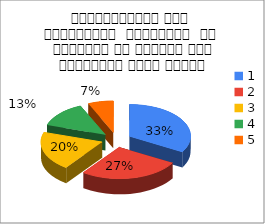
| Category | Series 0 | महाविद्यालय में  कार्यस्थल  सहयोगीयो    के  व्यवहार के संदर्भ में संतुष्टि स्तर बताइए |
|---|---|---|
| 0 | 5 | 4 |
| 1 | 4 | 4 |
| 2 | 3 | 1 |
| 3 | 2 | 1 |
| 4 | 1 | 0 |